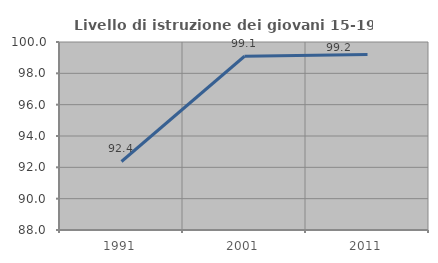
| Category | Livello di istruzione dei giovani 15-19 anni |
|---|---|
| 1991.0 | 92.373 |
| 2001.0 | 99.091 |
| 2011.0 | 99.206 |